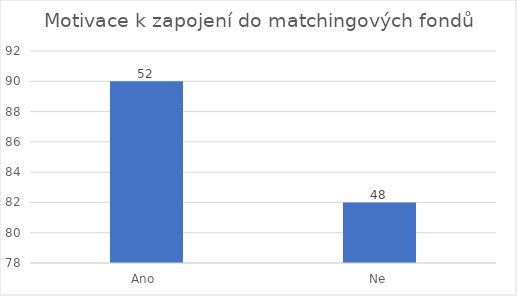
| Category | Počet respondentů |
|---|---|
| Ano  | 90 |
| Ne | 82 |